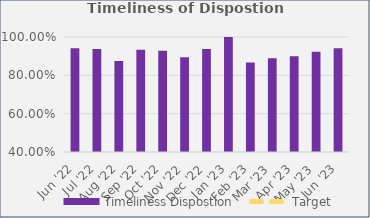
| Category | Timeliness Dispostion |
|---|---|
| Jun '22 | 0.941 |
| Jul '22 | 0.938 |
| Aug '22 | 0.875 |
| Sep '22 | 0.933 |
| Oct '22 | 0.929 |
| Nov '22 | 0.895 |
| Dec '22 | 0.938 |
| Jan '23 | 1 |
| Feb '23 | 0.867 |
| Mar '23 | 0.889 |
| Apr '23 | 0.9 |
| May '23 | 0.923 |
| Jun '23 | 0.941 |